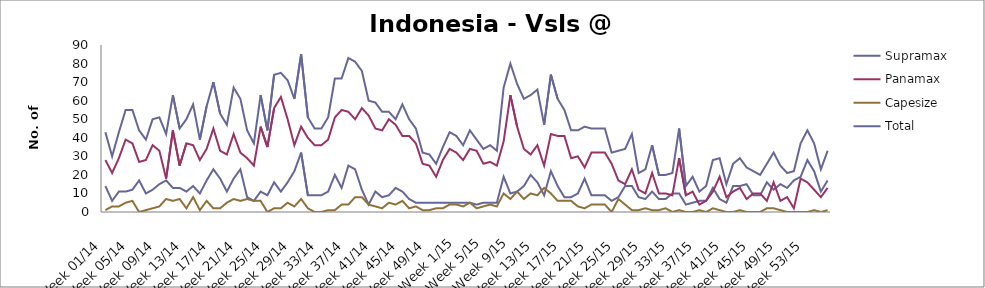
| Category | Supramax | Panamax | Capesize | Total |
|---|---|---|---|---|
| Week 01/14 | 14 | 28 | 1 | 43 |
| Week 02/14 | 6 | 21 | 3 | 30 |
| Week 03/14 | 11 | 29 | 3 | 43 |
| Week 04/14 | 11 | 39 | 5 | 55 |
| Week 05/14 | 12 | 37 | 6 | 55 |
| Week 06/14 | 17 | 27 | 0 | 44 |
| Week 07/14 | 10 | 28 | 1 | 39 |
| Week 08/14 | 12 | 36 | 2 | 50 |
| Week 09/14 | 15 | 33 | 3 | 51 |
| Week 10/14 | 17 | 18 | 7 | 42 |
| Week 11/14 | 13 | 44 | 6 | 63 |
| Week 12/14 | 13 | 25 | 7 | 45 |
| Week 13/14 | 11 | 37 | 2 | 50 |
| Week 14/14 | 14 | 36 | 8 | 58 |
| Week 15/14 | 10 | 28 | 1 | 39 |
| Week 16/14 | 17 | 34 | 6 | 57 |
| Week 17/14 | 23 | 45 | 2 | 70 |
| Week 18/14 | 18 | 33 | 2 | 53 |
| Week 19/14 | 11 | 31 | 5 | 47 |
| Week 20/14 | 18 | 42 | 7 | 67 |
| Week 21/14 | 23 | 32 | 6 | 61 |
| Week 22/14 | 8 | 29 | 7 | 44 |
| Week 23/14 | 6 | 25 | 6 | 37 |
| Week 24/14 | 11 | 46 | 6 | 63 |
| Week 25/14 | 9 | 35 | 0 | 44 |
| Week 26/14 | 16 | 56 | 2 | 74 |
| Week 27/14 | 11 | 62 | 2 | 75 |
| Week 28/14 | 16 | 50 | 5 | 71 |
| Week 29/14 | 22 | 36 | 3 | 61 |
| Week 30/14 | 32 | 46 | 7 | 85 |
| Week 31/14 | 9 | 40 | 2 | 51 |
| Week 32/14 | 9 | 36 | 0 | 45 |
| Week 33/14 | 9 | 36 | 0 | 45 |
| Week 34/14 | 11 | 39 | 1 | 51 |
| Week 35/14 | 20 | 51 | 1 | 72 |
| Week 36/14 | 13 | 55 | 4 | 72 |
| Week 37/14 | 25 | 54 | 4 | 83 |
| Week 38/14 | 23 | 50 | 8 | 81 |
| Week 39/14 | 12 | 56 | 8 | 76 |
| Week 40/14 | 4 | 52 | 4 | 60 |
| Week 41/14 | 11 | 45 | 3 | 59 |
| Week 42/14 | 8 | 44 | 2 | 54 |
| Week 43/14 | 9 | 50 | 5 | 54 |
| Week 44/14 | 13 | 47 | 4 | 50 |
| Week 45/14 | 11 | 41 | 6 | 58 |
| Week 46/14 | 7 | 41 | 2 | 50 |
| Week 47/14 | 5 | 37 | 3 | 45 |
| Week 48/14 | 5 | 26 | 1 | 32 |
| Week 49/14 | 5 | 25 | 1 | 31 |
| Week 50/14 | 5 | 19 | 2 | 26 |
| Week 51/14 | 5 | 28 | 2 | 35 |
| Week 52/14 | 5 | 34 | 4 | 43 |
| Week 1/15 | 5 | 32 | 4 | 41 |
| Week 2/15 | 5 | 28 | 3 | 36 |
| Week 3/15 | 5 | 34 | 5 | 44 |
| Week 4/15 | 4 | 33 | 2 | 39 |
| Week 5/15 | 5 | 26 | 3 | 34 |
| Week 6/15 | 5 | 27 | 4 | 36 |
| Week 7/15 | 5 | 25 | 3 | 33 |
| Week 8/15 | 19 | 38 | 10 | 67 |
| Week 9/15 | 10 | 63 | 7 | 80 |
| Week 10/15 | 11 | 46 | 11 | 69 |
| Week 11/15 | 14 | 34 | 7 | 61 |
| Week 12/15 | 20 | 31 | 10 | 63 |
| Week 13/15 | 16 | 36 | 9 | 66 |
| Week 14/15 | 9 | 25 | 13 | 47 |
| Week 15/15 | 22 | 42 | 10 | 74 |
| Week 16/15 | 14 | 41 | 6 | 61 |
| Week 17/15 | 8 | 41 | 6 | 55 |
| Week 18/15 | 8 | 29 | 6 | 44 |
| Week 19/15 | 10 | 30 | 3 | 44 |
| Week 20/15 | 18 | 24 | 2 | 46 |
| Week 21/15 | 9 | 32 | 4 | 45 |
| Week 22/15 | 9 | 32 | 4 | 45 |
| Week 23/15 | 9 | 32 | 4 | 45 |
| Week 24/15 | 6 | 26 | 0 | 32 |
| Week 25/15 | 8 | 17 | 7 | 33 |
| Week 26/15 | 14 | 15 | 4 | 34 |
| Week 27/15 | 14 | 23 | 1 | 42 |
| Week 28/15 | 8 | 12 | 1 | 21 |
| Week 29/15 | 7 | 10 | 2 | 23 |
| Week 30/15 | 11 | 21 | 1 | 36 |
| Week 31/15 | 7 | 10 | 1 | 20 |
| Week 32/15 | 7 | 10 | 2 | 20 |
| Week 33/15 | 10 | 9 | 0 | 21 |
| Week 34/15 | 10 | 29 | 1 | 45 |
| Week 35/15 | 4 | 9 | 0 | 14 |
| Week 36/15 | 5 | 11 | 0 | 19 |
| Week 37/15 | 6 | 4 | 1 | 11 |
| Week 38/15 | 6 | 6 | 0 | 14 |
| Week 39/15 | 13 | 11 | 2 | 28 |
| Week 40/15 | 7 | 19 | 1 | 29 |
| Week 41/15 | 5 | 8 | 0 | 15 |
| Week 42/15 | 14 | 11 | 0 | 26 |
| Week 43/15 | 14 | 13 | 1 | 29 |
| Week 44/15 | 15 | 7 | 0 | 24 |
| Week 45/15 | 9 | 10 | 0 | 22 |
| Week 46/15 | 9 | 10 | 0 | 20 |
| Week 47/15 | 16 | 6 | 2 | 26 |
| Week 48/15 | 12 | 16 | 2 | 32 |
| Week 49/15 | 15 | 6 | 1 | 25 |
| Week 50/15 | 13 | 8 | 0 | 21 |
| Week 51/15 | 17 | 2 | 0 | 22 |
| Week 52/15 | 19 | 18 | 0 | 37 |
| Week 53/15 | 28 | 16 | 0 | 44 |
| Week 01/16 | 22 | 12 | 1 | 37 |